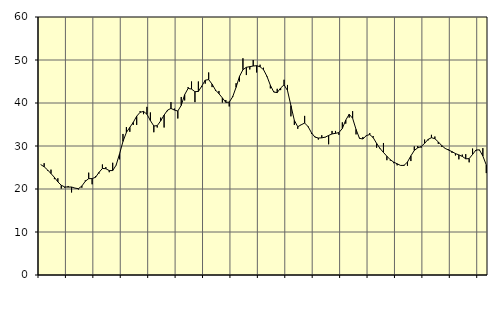
| Category | Piggar | Series 1 |
|---|---|---|
| nan | 25.7 | 25.68 |
| 87.0 | 26 | 25.17 |
| 87.0 | 24.3 | 24.44 |
| 87.0 | 24.5 | 23.59 |
| nan | 22.3 | 22.7 |
| 88.0 | 22.5 | 21.66 |
| 88.0 | 20.1 | 20.87 |
| 88.0 | 20.3 | 20.48 |
| nan | 20.7 | 20.45 |
| 89.0 | 19.2 | 20.46 |
| 89.0 | 20.2 | 20.21 |
| 89.0 | 19.9 | 20.07 |
| nan | 20.3 | 20.69 |
| 90.0 | 22 | 21.79 |
| 90.0 | 23.8 | 22.41 |
| 90.0 | 21.1 | 22.42 |
| nan | 23 | 22.73 |
| 91.0 | 23.6 | 23.86 |
| 91.0 | 25.7 | 24.78 |
| 91.0 | 25.1 | 24.72 |
| nan | 23.9 | 24.28 |
| 92.0 | 26.1 | 24.29 |
| 92.0 | 25.6 | 25.54 |
| 92.0 | 26.9 | 28.16 |
| nan | 32.8 | 31.06 |
| 93.0 | 34.4 | 33.16 |
| 93.0 | 33.3 | 34.34 |
| 93.0 | 34.9 | 35.5 |
| nan | 34.9 | 36.93 |
| 94.0 | 38.1 | 37.84 |
| 94.0 | 37.4 | 38.04 |
| 94.0 | 39.1 | 37.39 |
| nan | 37.8 | 35.9 |
| 95.0 | 33.2 | 34.66 |
| 95.0 | 34.3 | 34.73 |
| 95.0 | 36.6 | 35.85 |
| nan | 34.3 | 37.19 |
| 96.0 | 38.1 | 38.33 |
| 96.0 | 40.2 | 38.74 |
| 96.0 | 38.7 | 38.36 |
| nan | 36.4 | 38.13 |
| 97.0 | 41.4 | 39.45 |
| 97.0 | 40.6 | 41.94 |
| 97.0 | 43.7 | 43.39 |
| nan | 45 | 43.24 |
| 98.0 | 40.2 | 42.63 |
| 98.0 | 45 | 42.69 |
| 98.0 | 43.7 | 43.94 |
| nan | 44.5 | 45.31 |
| 99.0 | 47.1 | 45.44 |
| 99.0 | 43.7 | 44.38 |
| 99.0 | 42.8 | 43.01 |
| nan | 42.8 | 42.16 |
| 0.0 | 40.1 | 41.18 |
| 0.0 | 40.7 | 40.15 |
| 0.0 | 39.2 | 40.2 |
| nan | 41.6 | 41.43 |
| 1.0 | 44.6 | 43.65 |
| 1.0 | 45 | 46.2 |
| 1.0 | 50.4 | 47.74 |
| nan | 46.5 | 48.3 |
| 2.0 | 47.8 | 48.45 |
| 2.0 | 50 | 48.6 |
| 2.0 | 47.1 | 48.68 |
| nan | 48.9 | 48.42 |
| 3.0 | 48.2 | 47.76 |
| 3.0 | 46.1 | 46.22 |
| 3.0 | 43.4 | 44.13 |
| nan | 42.7 | 42.54 |
| 4.0 | 43.3 | 42.42 |
| 4.0 | 43 | 43.49 |
| 4.0 | 45.4 | 44.22 |
| nan | 44.2 | 42.9 |
| 5.0 | 36.9 | 39.4 |
| 5.0 | 34.9 | 35.95 |
| 5.0 | 34 | 34.48 |
| nan | 35 | 34.93 |
| 6.0 | 37 | 35.34 |
| 6.0 | 34.4 | 34.53 |
| 6.0 | 32.8 | 33.07 |
| nan | 32.2 | 32.07 |
| 7.0 | 31.5 | 31.86 |
| 7.0 | 32.5 | 31.89 |
| 7.0 | 32 | 32.06 |
| nan | 30.4 | 32.45 |
| 8.0 | 33.5 | 32.81 |
| 8.0 | 33.5 | 32.94 |
| 8.0 | 32.6 | 33.12 |
| nan | 35.5 | 34.07 |
| 9.0 | 35.2 | 36.03 |
| 9.0 | 36.6 | 37.38 |
| 9.0 | 38.1 | 36.45 |
| nan | 32.7 | 33.86 |
| 10.0 | 31.9 | 31.78 |
| 10.0 | 32.1 | 31.63 |
| 10.0 | 32.3 | 32.43 |
| nan | 33 | 32.66 |
| 11.0 | 32.3 | 31.95 |
| 11.0 | 29.6 | 30.61 |
| 11.0 | 29.3 | 29.42 |
| nan | 30.7 | 28.5 |
| 12.0 | 26.7 | 27.62 |
| 12.0 | 26.6 | 26.8 |
| 12.0 | 26 | 26.25 |
| nan | 25.5 | 25.86 |
| 13.0 | 25.5 | 25.48 |
| 13.0 | 25.6 | 25.49 |
| 13.0 | 25.4 | 26.27 |
| nan | 26.5 | 27.71 |
| 14.0 | 29.9 | 28.97 |
| 14.0 | 30 | 29.57 |
| 14.0 | 29.6 | 29.87 |
| nan | 31.5 | 30.61 |
| 15.0 | 31.3 | 31.52 |
| 15.0 | 32.6 | 31.93 |
| 15.0 | 32.2 | 31.7 |
| nan | 30.5 | 30.95 |
| 16.0 | 29.8 | 30.1 |
| 16.0 | 29.4 | 29.44 |
| 16.0 | 29.2 | 29.05 |
| nan | 28.4 | 28.69 |
| 17.0 | 27.8 | 28.24 |
| 17.0 | 26.9 | 27.93 |
| 17.0 | 28 | 27.58 |
| nan | 28.1 | 27.02 |
| 18.0 | 26.2 | 27.07 |
| 18.0 | 29.4 | 28.04 |
| 18.0 | 28.9 | 29.07 |
| nan | 29 | 29.1 |
| 19.0 | 29.5 | 27.67 |
| 19.0 | 23.7 | 25.59 |